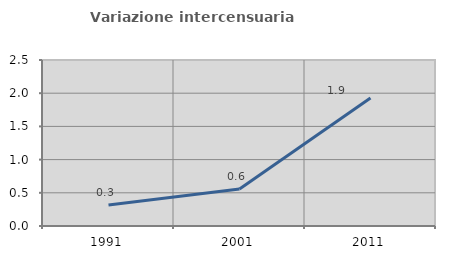
| Category | Variazione intercensuaria annua |
|---|---|
| 1991.0 | 0.316 |
| 2001.0 | 0.557 |
| 2011.0 | 1.928 |